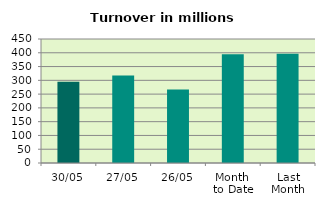
| Category | Series 0 |
|---|---|
| 30/05 | 294.895 |
| 27/05 | 317.721 |
| 26/05 | 266.44 |
| Month 
to Date | 394.367 |
| Last
Month | 396.429 |